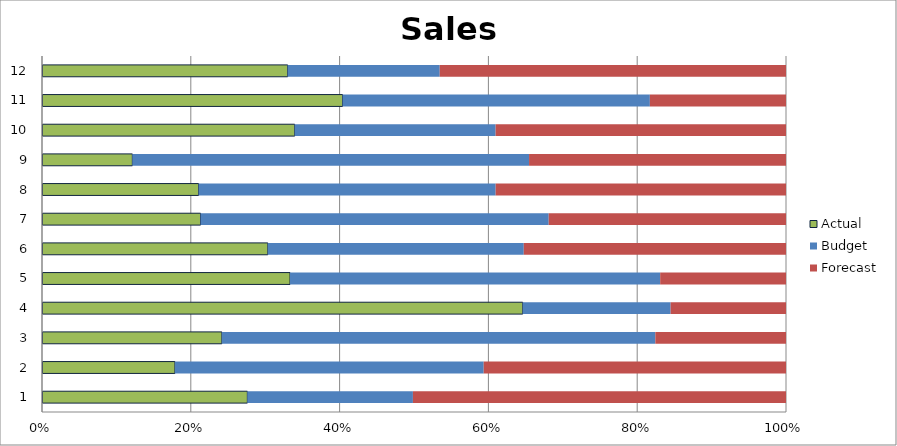
| Category | Actual | Budget | Forecast |
|---|---|---|---|
| 0 | 1910 | 1540 | 3470 |
| 1 | 1020 | 2370 | 2320 |
| 2 | 1170 | 2820 | 850 |
| 3 | 3250 | 1000 | 780 |
| 4 | 1360 | 2030 | 690 |
| 5 | 2170 | 2460 | 2520 |
| 6 | 1430 | 3140 | 2140 |
| 7 | 1640 | 3110 | 3040 |
| 8 | 640 | 2810 | 1820 |
| 9 | 1610 | 1280 | 1850 |
| 10 | 2230 | 2280 | 1010 |
| 11 | 1050 | 650 | 1480 |